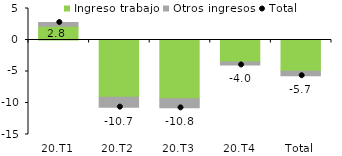
| Category | Ingreso trabajo | Otros ingresos |
|---|---|---|
| 20.T1 | 2.173 | 0.603 |
| 20.T2 | -9.074 | -1.584 |
| 20.T3 | -9.32 | -1.453 |
| 20.T4 | -3.504 | -0.457 |
| Total | -4.943 | -0.725 |